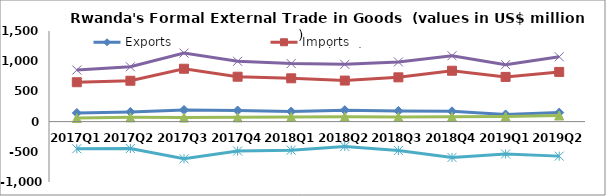
| Category | Exports | Imports | Re-Exports | Total Trade | Trade Balance |
|---|---|---|---|---|---|
| 2017Q1 | 143.077 | 651.996 | 59.162 | 854.234 | -449.757 |
| 2017Q2 | 160.66 | 676.27 | 70.307 | 907.238 | -445.303 |
| 2017Q3 | 192.175 | 875.018 | 67.195 | 1134.389 | -615.648 |
| 2017Q4 | 184.236 | 743.149 | 71.45 | 998.836 | -487.463 |
| 2018Q1 | 166.601 | 716.727 | 77.492 | 960.82 | -472.634 |
| 2018Q2 | 188.932 | 679.31 | 79.223 | 947.465 | -411.154 |
| 2018Q3 | 177.258 | 732.939 | 77.1 | 987.297 | -478.581 |
| 2018Q4 | 169.913 | 841.922 | 78.507 | 1090.342 | -593.501 |
| 2019Q1 | 118.717 | 739.974 | 84.641 | 943.332 | -536.617 |
| 2019Q2 | 149.26 | 822.605 | 101.733 | 1073.598 | -571.612 |